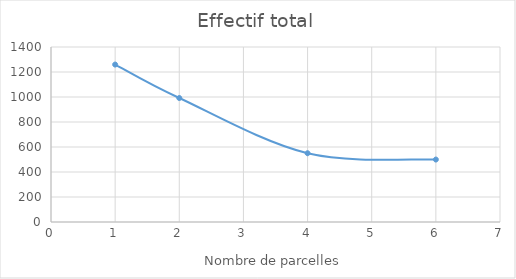
| Category | Effectif total |
|---|---|
| 1.0 | 1259.5 |
| 2.0 | 991.833 |
| 4.0 | 550.167 |
| 6.0 | 499.667 |